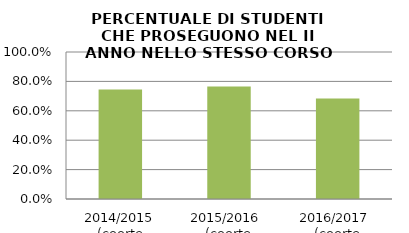
| Category | 2014/2015 (coorte 2013/14) 2015/2016  (coorte 2014/15) 2016/2017  (coorte 2015/16) |
|---|---|
| 2014/2015 (coorte 2013/14) | 0.745 |
| 2015/2016  (coorte 2014/15) | 0.766 |
| 2016/2017  (coorte 2015/16) | 0.683 |